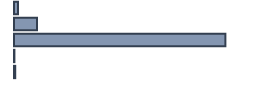
| Category | Percentatge |
|---|---|
| 0 | 1.704 |
| 1 | 9.54 |
| 2 | 88.075 |
| 3 | 0.17 |
| 4 | 0.511 |